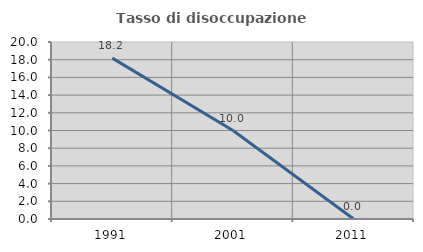
| Category | Tasso di disoccupazione giovanile  |
|---|---|
| 1991.0 | 18.182 |
| 2001.0 | 10 |
| 2011.0 | 0 |